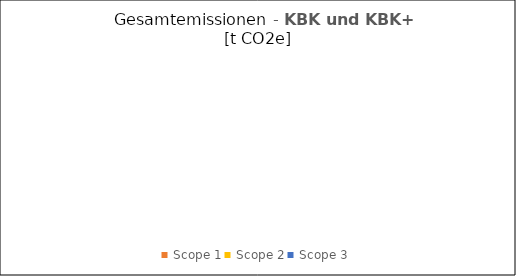
| Category | Series 0 |
|---|---|
| Scope 1 | 0 |
| Scope 2 | 0 |
| Scope 3 | 0 |